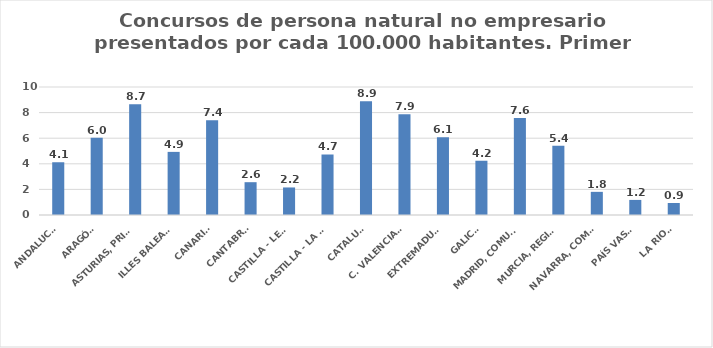
| Category | Series 0 |
|---|---|
| ANDALUCÍA | 4.122 |
| ARAGÓN | 6.036 |
| ASTURIAS, PRINCIPADO | 8.661 |
| ILLES BALEARS | 4.931 |
| CANARIAS | 7.397 |
| CANTABRIA | 2.563 |
| CASTILLA - LEÓN | 2.152 |
| CASTILLA - LA MANCHA | 4.727 |
| CATALUÑA | 8.891 |
| C. VALENCIANA | 7.877 |
| EXTREMADURA | 6.071 |
| GALICIA | 4.239 |
| MADRID, COMUNIDAD | 7.577 |
| MURCIA, REGIÓN | 5.42 |
| NAVARRA, COM. FORAL | 1.808 |
| PAÍS VASCO | 1.178 |
| LA RIOJA | 0.939 |